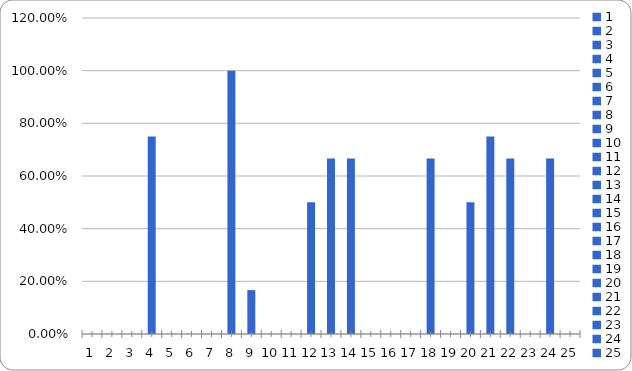
| Category | % |
|---|---|
| 0 | 0 |
| 1 | 0 |
| 2 | 0 |
| 3 | 0.75 |
| 4 | 0 |
| 5 | 0 |
| 6 | 0 |
| 7 | 1 |
| 8 | 0.167 |
| 9 | 0 |
| 10 | 0 |
| 11 | 0.5 |
| 12 | 0.667 |
| 13 | 0.667 |
| 14 | 0 |
| 15 | 0 |
| 16 | 0 |
| 17 | 0.667 |
| 18 | 0 |
| 19 | 0.5 |
| 20 | 0.75 |
| 21 | 0.667 |
| 22 | 0 |
| 23 | 0.667 |
| 24 | 0 |